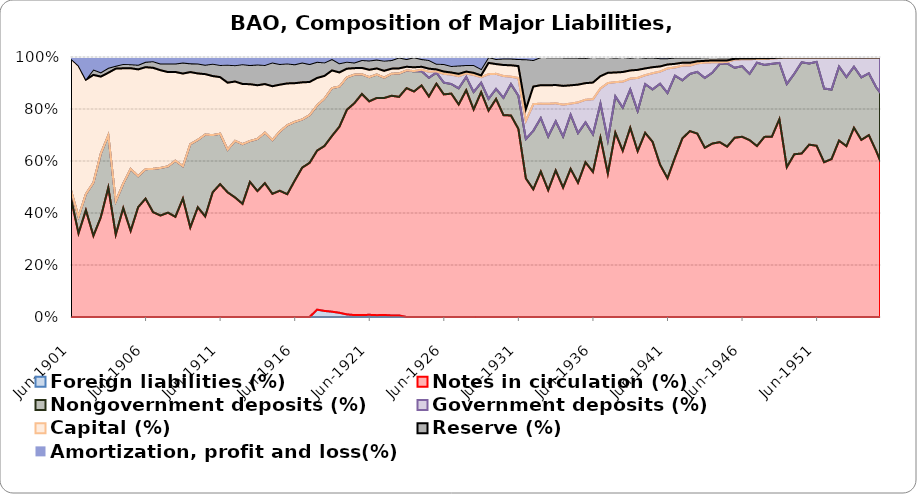
| Category | Foreign liabilities (%) | Notes in circulation (%) | Nongovernment deposits (%) | Government deposits (%) | Capital (%) | Reserve (%) | Amortization, profit and loss(%) |
|---|---|---|---|---|---|---|---|
| 1901-06-30 | 0 | 0.311 | 0.021 | 0 | 0.345 | 0 | 0.004 |
| 1901-12-31 | 0 | 0.146 | 0.029 | 0 | 0.263 | 0 | 0.015 |
| 1902-06-30 | 0 | 0.257 | 0.039 | 0 | 0.275 | 0.001 | 0.053 |
| 1902-12-31 | 0 | 0.163 | 0.107 | 0 | 0.217 | 0.011 | 0.025 |
| 1903-06-30 | 0 | 0.239 | 0.152 | 0 | 0.184 | 0.01 | 0.037 |
| 1903-12-31 | 0 | 0.42 | 0.169 | 0 | 0.203 | 0.016 | 0.035 |
| 1904-06-30 | 0 | 0.258 | 0.105 | 0 | 0.416 | 0.009 | 0.028 |
| 1904-12-31 | 0 | 0.389 | 0.088 | 0 | 0.411 | 0.016 | 0.025 |
| 1905-06-30 | 0 | 0.296 | 0.213 | 0 | 0.347 | 0.014 | 0.025 |
| 1905-12-31 | 0 | 0.396 | 0.112 | 0 | 0.385 | 0.017 | 0.028 |
| 1906-06-30 | 0 | 0.394 | 0.098 | 0 | 0.34 | 0.018 | 0.016 |
| 1906-12-31 | 0 | 0.366 | 0.151 | 0 | 0.353 | 0.023 | 0.015 |
| 1907-06-30 | 0 | 0.338 | 0.159 | 0 | 0.326 | 0.022 | 0.022 |
| 1907-12-31 | 0 | 0.343 | 0.152 | 0 | 0.31 | 0.028 | 0.021 |
| 1908-06-30 | 0 | 0.336 | 0.188 | 0 | 0.297 | 0.028 | 0.022 |
| 1908-12-31 | 0 | 0.404 | 0.111 | 0 | 0.316 | 0.037 | 0.019 |
| 1909-06-30 | 0 | 0.306 | 0.285 | 0 | 0.247 | 0.03 | 0.022 |
| 1909-12-31 | 0 | 0.348 | 0.214 | 0 | 0.211 | 0.032 | 0.021 |
| 1910-06-30 | 0 | 0.352 | 0.287 | 0 | 0.212 | 0.033 | 0.027 |
| 1910-12-31 | 0 | 0.441 | 0.202 | 0 | 0.209 | 0.044 | 0.024 |
| 1911-06-30 | 0 | 0.452 | 0.172 | 0 | 0.192 | 0.041 | 0.027 |
| 1911-12-31 | 0 | 0.424 | 0.145 | 0 | 0.228 | 0.061 | 0.026 |
| 1912-06-30 | 0 | 0.411 | 0.195 | 0 | 0.204 | 0.056 | 0.028 |
| 1912-12-31 | 0 | 0.391 | 0.207 | 0 | 0.208 | 0.069 | 0.025 |
| 1913-06-30 | 0 | 0.448 | 0.136 | 0 | 0.189 | 0.063 | 0.027 |
| 1913-12-31 | 0 | 0.443 | 0.184 | 0 | 0.189 | 0.073 | 0.027 |
| 1914-06-30 | 0 | 0.46 | 0.174 | 0 | 0.167 | 0.066 | 0.027 |
| 1914-12-31 | 0 | 0.444 | 0.193 | 0 | 0.194 | 0.085 | 0.02 |
| 1915-06-30 | 0 | 0.463 | 0.217 | 0 | 0.172 | 0.076 | 0.026 |
| 1915-12-31 | 0 | 0.451 | 0.253 | 0 | 0.153 | 0.074 | 0.023 |
| 1916-06-30 | 0 | 0.495 | 0.214 | 0 | 0.14 | 0.068 | 0.027 |
| 1916-12-31 | 0 | 0.541 | 0.174 | 0 | 0.134 | 0.072 | 0.02 |
| 1917-06-30 | 0 | 0.557 | 0.173 | 0 | 0.12 | 0.065 | 0.026 |
| 1917-12-31 | 0.026 | 0.569 | 0.162 | 0 | 0.098 | 0.058 | 0.017 |
| 1918-06-30 | 0.021 | 0.578 | 0.166 | 0 | 0.079 | 0.047 | 0.019 |
| 1918-12-31 | 0.019 | 0.621 | 0.169 | 0 | 0.062 | 0.04 | 0.007 |
| 1919-06-30 | 0.015 | 0.663 | 0.143 | 0 | 0.05 | 0.033 | 0.022 |
| 1919-12-31 | 0.01 | 0.757 | 0.12 | 0 | 0.032 | 0.026 | 0.017 |
| 1920-06-30 | 0.007 | 0.796 | 0.108 | 0 | 0.024 | 0.021 | 0.021 |
| 1920-12-31 | 0.007 | 0.81 | 0.072 | 0 | 0.024 | 0.029 | 0.011 |
| 1921-06-30 | 0.008 | 0.779 | 0.088 | 0 | 0.027 | 0.034 | 0.013 |
| 1921-12-31 | 0.007 | 0.806 | 0.087 | 0 | 0.023 | 0.033 | 0.01 |
| 1922-06-30 | 0.007 | 0.793 | 0.074 | 0 | 0.025 | 0.037 | 0.013 |
| 1922-12-31 | 0.006 | 0.816 | 0.082 | 0 | 0.019 | 0.032 | 0.011 |
| 1923-06-30 | 0.005 | 0.784 | 0.084 | 0 | 0.018 | 0.039 | 0.002 |
| 1923-12-31 | 0 | 0.811 | 0.062 | 0.001 | 0.013 | 0.027 | 0.007 |
| 1924-06-30 | 0 | 0.81 | 0.073 | 0.001 | 0.014 | 0.036 | 0.001 |
| 1924-12-31 | 0 | 0.842 | 0.052 | 0.005 | 0.011 | 0.028 | 0.008 |
| 1925-06-30 | 0 | 0.796 | 0.068 | 0.022 | 0.011 | 0.031 | 0.011 |
| 1925-12-31 | 0 | 0.835 | 0.04 | 0.004 | 0.007 | 0.021 | 0.024 |
| 1926-06-30 | 0 | 0.784 | 0.042 | 0.031 | 0.008 | 0.027 | 0.025 |
| 1926-12-31 | 0 | 0.819 | 0.035 | 0.035 | 0.007 | 0.024 | 0.033 |
| 1927-06-30 | 0 | 0.76 | 0.058 | 0.043 | 0.008 | 0.03 | 0.031 |
| 1927-12-31 | 0 | 0.848 | 0.049 | 0.013 | 0.007 | 0.025 | 0.03 |
| 1928-06-30 | 0 | 0.74 | 0.062 | 0.061 | 0.007 | 0.028 | 0.028 |
| 1928-12-31 | 0 | 0.806 | 0.034 | 0.02 | 0.006 | 0.023 | 0.043 |
| 1929-06-30 | 0 | 0.732 | 0.042 | 0.087 | 0.04 | 0.021 | 0 |
| 1929-12-31 | 0 | 0.805 | 0.037 | 0.056 | 0.036 | 0.019 | 0.007 |
| 1930-06-30 | 0 | 0.752 | 0.065 | 0.081 | 0.041 | 0.024 | 0.006 |
| 1930-12-31 | 0 | 0.744 | 0.116 | 0.027 | 0.042 | 0.025 | 0.006 |
| 1931-06-30 | 0 | 0.695 | 0.122 | 0.065 | 0.044 | 0.026 | 0.008 |
| 1931-12-31 | 0 | 0.483 | 0.137 | 0.063 | 0.041 | 0.174 | 0.008 |
| 1932-06-30 | 0 | 0.464 | 0.212 | 0.097 | 0.064 | 0.097 | 0.011 |
| 1932-12-31 | 0 | 0.526 | 0.194 | 0.052 | 0.067 | 0.102 | 0 |
| 1933-06-30 | 0 | 0.468 | 0.198 | 0.121 | 0.068 | 0.104 | 0.001 |
| 1933-12-31 | 0 | 0.541 | 0.182 | 0.066 | 0.067 | 0.103 | 0.001 |
| 1934-06-30 | 0 | 0.446 | 0.176 | 0.11 | 0.065 | 0.098 | 0.001 |
| 1934-12-31 | 0 | 0.491 | 0.18 | 0.037 | 0.061 | 0.092 | 0.002 |
| 1935-06-30 | 0 | 0.463 | 0.171 | 0.106 | 0.061 | 0.093 | 0.002 |
| 1935-12-31 | 0 | 0.514 | 0.133 | 0.075 | 0.055 | 0.084 | 0.003 |
| 1936-06-30 | 0 | 0.502 | 0.13 | 0.121 | 0.058 | 0.088 | 0 |
| 1936-12-31 | 0 | 0.615 | 0.117 | 0.052 | 0.042 | 0.065 | 0.001 |
| 1937-06-30 | 0 | 0.495 | 0.115 | 0.197 | 0.035 | 0.055 | 0 |
| 1937-12-31 | 0 | 0.659 | 0.13 | 0.051 | 0.034 | 0.053 | 0.002 |
| 1938-06-30 | 0 | 0.597 | 0.155 | 0.094 | 0.034 | 0.054 | 0 |
| 1938-12-31 | 0 | 0.677 | 0.137 | 0.039 | 0.029 | 0.046 | 0.003 |
| 1939-06-30 | 0 | 0.594 | 0.144 | 0.119 | 0.029 | 0.046 | 0 |
| 1939-12-31 | 0 | 0.666 | 0.176 | 0.032 | 0.024 | 0.039 | 0.002 |
| 1940-06-30 | 0 | 0.633 | 0.189 | 0.058 | 0.022 | 0.035 | 0.002 |
| 1940-12-31 | 0 | 0.536 | 0.286 | 0.043 | 0.018 | 0.029 | 0.004 |
| 1941-06-30 | 0 | 0.441 | 0.271 | 0.078 | 0.012 | 0.02 | 0.004 |
| 1941-12-31 | 0 | 0.564 | 0.29 | 0.029 | 0.013 | 0.022 | 0.002 |
| 1942-06-30 | 0 | 0.647 | 0.211 | 0.053 | 0.01 | 0.019 | 0.002 |
| 1942-12-31 | 0 | 0.613 | 0.189 | 0.027 | 0.009 | 0.018 | 0.002 |
| 1943-06-30 | 0 | 0.682 | 0.229 | 0.032 | 0.007 | 0.014 | 0.002 |
| 1943-12-31 | 0 | 0.633 | 0.261 | 0.057 | 0.007 | 0.013 | 0.001 |
| 1944-06-30 | 0 | 0.647 | 0.264 | 0.039 | 0.007 | 0.013 | 0 |
| 1944-12-31 | 0 | 0.649 | 0.291 | 0.006 | 0.006 | 0.013 | 0.001 |
| 1945-06-30 | 0 | 0.598 | 0.293 | 0.005 | 0.006 | 0.011 | 0.001 |
| 1945-12-31 | 0 | 0.633 | 0.247 | 0.029 | 0.003 | 0.006 | 0.001 |
| 1946-06-30 | 0 | 0.586 | 0.23 | 0.022 | 0.003 | 0.005 | 0 |
| 1946-12-31 | 0 | 0.577 | 0.216 | 0.048 | 0.002 | 0.005 | 0 |
| 1947-06-30 | 0 | 0.553 | 0.269 | 0.012 | 0.002 | 0.004 | 0 |
| 1947-12-31 | 0 | 0.566 | 0.226 | 0.019 | 0.002 | 0.004 | 0 |
| 1948-06-30 | 0 | 0.571 | 0.231 | 0.017 | 0.002 | 0.003 | 0 |
| 1948-12-31 | 0 | 0.66 | 0.188 | 0.016 | 0.001 | 0.002 | 0 |
| 1949-06-30 | 0 | 0.513 | 0.284 | 0.09 | 0.001 | 0.002 | 0 |
| 1949-12-31 | 0 | 0.541 | 0.268 | 0.053 | 0.001 | 0.002 | 0 |
| 1950-06-30 | 0 | 0.545 | 0.304 | 0.015 | 0.001 | 0.002 | 0 |
| 1950-12-31 | 0 | 0.584 | 0.275 | 0.019 | 0.001 | 0.002 | 0 |
| 1951-06-30 | 0 | 0.59 | 0.289 | 0.015 | 0.001 | 0.002 | 0 |
| 1951-12-31 | 0 | 0.53 | 0.252 | 0.106 | 0.001 | 0.001 | 0 |
| 1952-06-30 | 0 | 0.581 | 0.256 | 0.118 | 0.001 | 0.001 | 0 |
| 1952-12-31 | 0 | 0.642 | 0.269 | 0.032 | 0.001 | 0.002 | 0.001 |
| 1953-06-30 | 0 | 0.608 | 0.246 | 0.069 | 0.001 | 0.002 | 0 |
| 1953-12-31 | 0 | 0.695 | 0.224 | 0.033 | 0 | 0.002 | 0.001 |
| 1954-06-30 | 0 | 0.629 | 0.222 | 0.07 | 0 | 0.002 | 0 |
| 1954-12-31 | 0 | 0.669 | 0.227 | 0.057 | 0 | 0.002 | 0 |
| 1955-06-30 | 0 | 0.613 | 0.236 | 0.11 | 0 | 0.002 | 0 |
| 1955-09-30 | 0 | 0.578 | 0.251 | 0.128 | 0 | 0.002 | 0 |